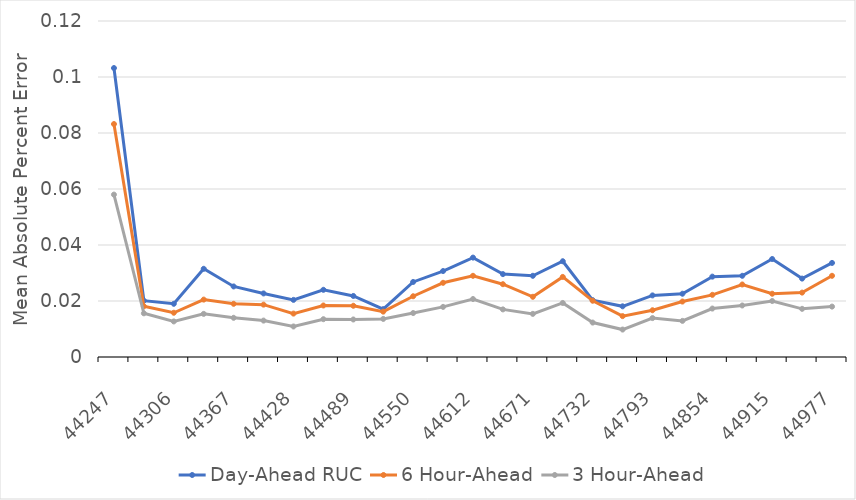
| Category | Day-Ahead RUC | 6 Hour-Ahead | 3 Hour-Ahead |
|---|---|---|---|
| 44247.0 | 0.103 | 0.083 | 0.058 |
| 44275.0 | 0.02 | 0.018 | 0.016 |
| 44306.0 | 0.019 | 0.016 | 0.013 |
| 44336.0 | 0.032 | 0.02 | 0.015 |
| 44367.0 | 0.025 | 0.019 | 0.014 |
| 44397.0 | 0.023 | 0.019 | 0.013 |
| 44428.0 | 0.02 | 0.016 | 0.011 |
| 44459.0 | 0.024 | 0.018 | 0.014 |
| 44489.0 | 0.022 | 0.018 | 0.013 |
| 44520.0 | 0.017 | 0.016 | 0.014 |
| 44550.0 | 0.027 | 0.022 | 0.016 |
| 44581.0 | 0.031 | 0.026 | 0.018 |
| 44612.0 | 0.036 | 0.029 | 0.021 |
| 44640.0 | 0.03 | 0.026 | 0.017 |
| 44671.0 | 0.029 | 0.022 | 0.015 |
| 44701.0 | 0.034 | 0.029 | 0.019 |
| 44732.0 | 0.02 | 0.02 | 0.012 |
| 44762.0 | 0.018 | 0.015 | 0.01 |
| 44793.0 | 0.022 | 0.017 | 0.014 |
| 44824.0 | 0.023 | 0.02 | 0.013 |
| 44854.0 | 0.029 | 0.022 | 0.017 |
| 44885.0 | 0.029 | 0.026 | 0.018 |
| 44915.0 | 0.035 | 0.023 | 0.02 |
| 44946.0 | 0.028 | 0.023 | 0.017 |
| 44977.0 | 0.034 | 0.029 | 0.018 |